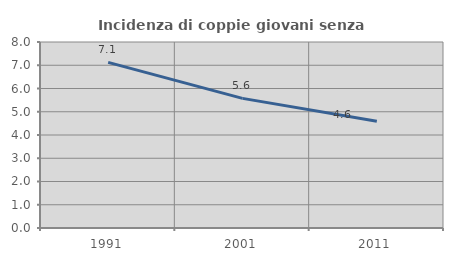
| Category | Incidenza di coppie giovani senza figli |
|---|---|
| 1991.0 | 7.122 |
| 2001.0 | 5.576 |
| 2011.0 | 4.591 |